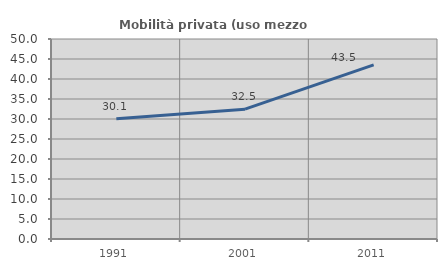
| Category | Mobilità privata (uso mezzo privato) |
|---|---|
| 1991.0 | 30.075 |
| 2001.0 | 32.453 |
| 2011.0 | 43.534 |